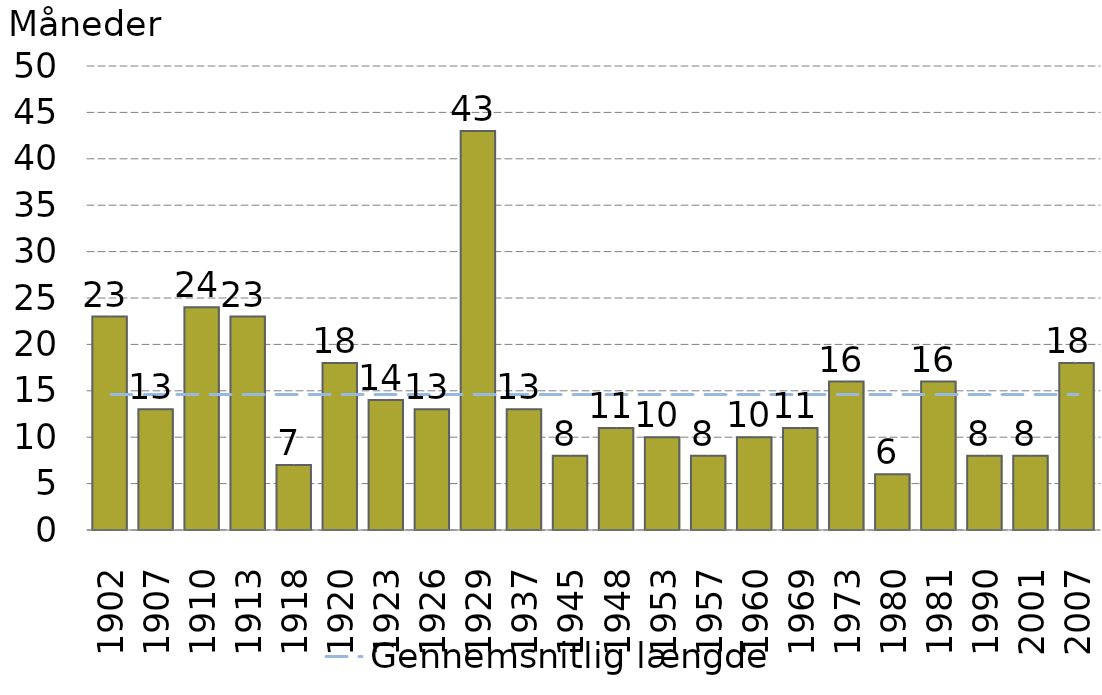
| Category | Antal recessionsmåneder |
|---|---|
| 1902.0 | 23 |
| 1907.0 | 13 |
| 1910.0 | 24 |
| 1913.0 | 23 |
| 1918.0 | 7 |
| 1920.0 | 18 |
| 1923.0 | 14 |
| 1926.0 | 13 |
| 1929.0 | 43 |
| 1937.0 | 13 |
| 1945.0 | 8 |
| 1948.0 | 11 |
| 1953.0 | 10 |
| 1957.0 | 8 |
| 1960.0 | 10 |
| 1969.0 | 11 |
| 1973.0 | 16 |
| 1980.0 | 6 |
| 1981.0 | 16 |
| 1990.0 | 8 |
| 2001.0 | 8 |
| 2007.0 | 18 |